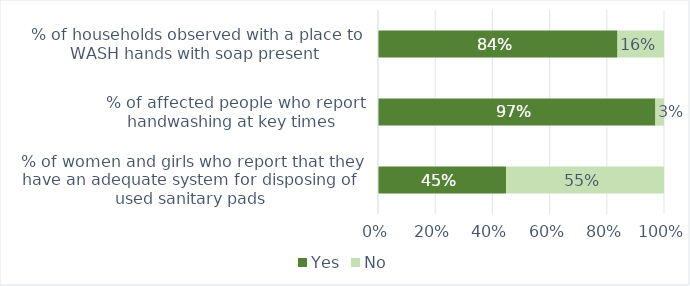
| Category | Yes | No |
|---|---|---|
|  % of women and girls who report that they have an adequate system for disposing of used sanitary pads | 0.448 | 0.552 |
|  % of affected people who report handwashing at key times | 0.97 | 0.03 |
|  % of households observed with a place to WASH hands with soap present | 0.838 | 0.162 |